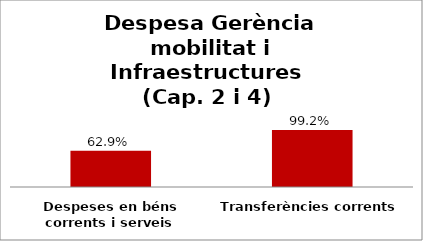
| Category | Series 0 |
|---|---|
| Despeses en béns corrents i serveis | 0.629 |
| Transferències corrents | 0.992 |